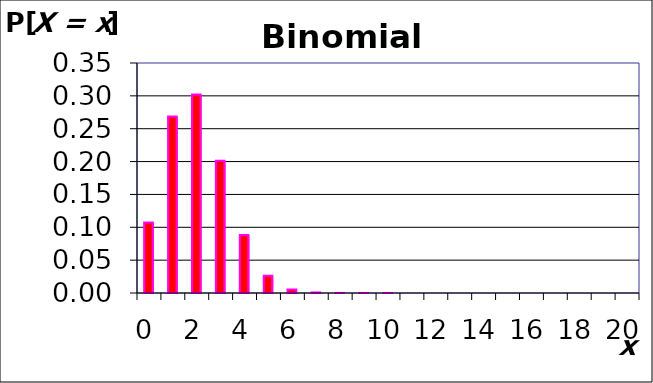
| Category | P[X = x] |
|---|---|
| 0.0 | 0.107 |
| 1.0 | 0.268 |
| 2.0 | 0.302 |
| 3.0 | 0.201 |
| 4.0 | 0.088 |
| 5.0 | 0.026 |
| 6.0 | 0.006 |
| 7.0 | 0.001 |
| 8.0 | 0 |
| 9.0 | 0 |
| 10.0 | 0 |
| 11.0 | 0 |
| 12.0 | 0 |
| 13.0 | 0 |
| 14.0 | 0 |
| 15.0 | 0 |
| 16.0 | 0 |
| 17.0 | 0 |
| 18.0 | 0 |
| 19.0 | 0 |
| 20.0 | 0 |